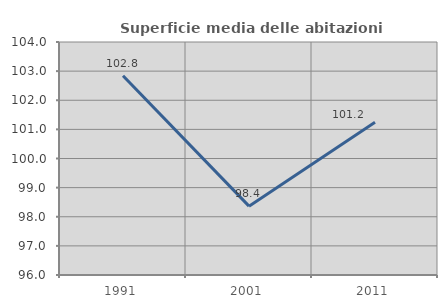
| Category | Superficie media delle abitazioni occupate |
|---|---|
| 1991.0 | 102.841 |
| 2001.0 | 98.364 |
| 2011.0 | 101.242 |